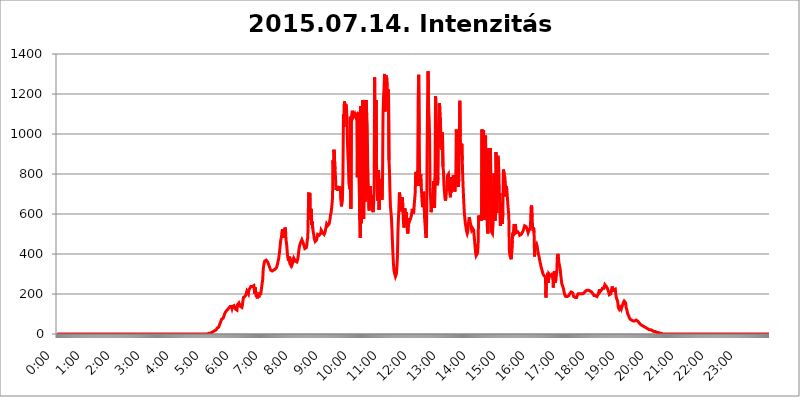
| Category | 2015.07.14. Intenzitás [W/m^2] |
|---|---|
| 0.0 | 0 |
| 0.0006944444444444445 | 0 |
| 0.001388888888888889 | 0 |
| 0.0020833333333333333 | 0 |
| 0.002777777777777778 | 0 |
| 0.003472222222222222 | 0 |
| 0.004166666666666667 | 0 |
| 0.004861111111111111 | 0 |
| 0.005555555555555556 | 0 |
| 0.0062499999999999995 | 0 |
| 0.006944444444444444 | 0 |
| 0.007638888888888889 | 0 |
| 0.008333333333333333 | 0 |
| 0.009027777777777779 | 0 |
| 0.009722222222222222 | 0 |
| 0.010416666666666666 | 0 |
| 0.011111111111111112 | 0 |
| 0.011805555555555555 | 0 |
| 0.012499999999999999 | 0 |
| 0.013194444444444444 | 0 |
| 0.013888888888888888 | 0 |
| 0.014583333333333332 | 0 |
| 0.015277777777777777 | 0 |
| 0.015972222222222224 | 0 |
| 0.016666666666666666 | 0 |
| 0.017361111111111112 | 0 |
| 0.018055555555555557 | 0 |
| 0.01875 | 0 |
| 0.019444444444444445 | 0 |
| 0.02013888888888889 | 0 |
| 0.020833333333333332 | 0 |
| 0.02152777777777778 | 0 |
| 0.022222222222222223 | 0 |
| 0.02291666666666667 | 0 |
| 0.02361111111111111 | 0 |
| 0.024305555555555556 | 0 |
| 0.024999999999999998 | 0 |
| 0.025694444444444447 | 0 |
| 0.02638888888888889 | 0 |
| 0.027083333333333334 | 0 |
| 0.027777777777777776 | 0 |
| 0.02847222222222222 | 0 |
| 0.029166666666666664 | 0 |
| 0.029861111111111113 | 0 |
| 0.030555555555555555 | 0 |
| 0.03125 | 0 |
| 0.03194444444444445 | 0 |
| 0.03263888888888889 | 0 |
| 0.03333333333333333 | 0 |
| 0.034027777777777775 | 0 |
| 0.034722222222222224 | 0 |
| 0.035416666666666666 | 0 |
| 0.036111111111111115 | 0 |
| 0.03680555555555556 | 0 |
| 0.0375 | 0 |
| 0.03819444444444444 | 0 |
| 0.03888888888888889 | 0 |
| 0.03958333333333333 | 0 |
| 0.04027777777777778 | 0 |
| 0.04097222222222222 | 0 |
| 0.041666666666666664 | 0 |
| 0.042361111111111106 | 0 |
| 0.04305555555555556 | 0 |
| 0.043750000000000004 | 0 |
| 0.044444444444444446 | 0 |
| 0.04513888888888889 | 0 |
| 0.04583333333333334 | 0 |
| 0.04652777777777778 | 0 |
| 0.04722222222222222 | 0 |
| 0.04791666666666666 | 0 |
| 0.04861111111111111 | 0 |
| 0.049305555555555554 | 0 |
| 0.049999999999999996 | 0 |
| 0.05069444444444445 | 0 |
| 0.051388888888888894 | 0 |
| 0.052083333333333336 | 0 |
| 0.05277777777777778 | 0 |
| 0.05347222222222222 | 0 |
| 0.05416666666666667 | 0 |
| 0.05486111111111111 | 0 |
| 0.05555555555555555 | 0 |
| 0.05625 | 0 |
| 0.05694444444444444 | 0 |
| 0.057638888888888885 | 0 |
| 0.05833333333333333 | 0 |
| 0.05902777777777778 | 0 |
| 0.059722222222222225 | 0 |
| 0.06041666666666667 | 0 |
| 0.061111111111111116 | 0 |
| 0.06180555555555556 | 0 |
| 0.0625 | 0 |
| 0.06319444444444444 | 0 |
| 0.06388888888888888 | 0 |
| 0.06458333333333334 | 0 |
| 0.06527777777777778 | 0 |
| 0.06597222222222222 | 0 |
| 0.06666666666666667 | 0 |
| 0.06736111111111111 | 0 |
| 0.06805555555555555 | 0 |
| 0.06874999999999999 | 0 |
| 0.06944444444444443 | 0 |
| 0.07013888888888889 | 0 |
| 0.07083333333333333 | 0 |
| 0.07152777777777779 | 0 |
| 0.07222222222222223 | 0 |
| 0.07291666666666667 | 0 |
| 0.07361111111111111 | 0 |
| 0.07430555555555556 | 0 |
| 0.075 | 0 |
| 0.07569444444444444 | 0 |
| 0.0763888888888889 | 0 |
| 0.07708333333333334 | 0 |
| 0.07777777777777778 | 0 |
| 0.07847222222222222 | 0 |
| 0.07916666666666666 | 0 |
| 0.0798611111111111 | 0 |
| 0.08055555555555556 | 0 |
| 0.08125 | 0 |
| 0.08194444444444444 | 0 |
| 0.08263888888888889 | 0 |
| 0.08333333333333333 | 0 |
| 0.08402777777777777 | 0 |
| 0.08472222222222221 | 0 |
| 0.08541666666666665 | 0 |
| 0.08611111111111112 | 0 |
| 0.08680555555555557 | 0 |
| 0.08750000000000001 | 0 |
| 0.08819444444444445 | 0 |
| 0.08888888888888889 | 0 |
| 0.08958333333333333 | 0 |
| 0.09027777777777778 | 0 |
| 0.09097222222222222 | 0 |
| 0.09166666666666667 | 0 |
| 0.09236111111111112 | 0 |
| 0.09305555555555556 | 0 |
| 0.09375 | 0 |
| 0.09444444444444444 | 0 |
| 0.09513888888888888 | 0 |
| 0.09583333333333333 | 0 |
| 0.09652777777777777 | 0 |
| 0.09722222222222222 | 0 |
| 0.09791666666666667 | 0 |
| 0.09861111111111111 | 0 |
| 0.09930555555555555 | 0 |
| 0.09999999999999999 | 0 |
| 0.10069444444444443 | 0 |
| 0.1013888888888889 | 0 |
| 0.10208333333333335 | 0 |
| 0.10277777777777779 | 0 |
| 0.10347222222222223 | 0 |
| 0.10416666666666667 | 0 |
| 0.10486111111111111 | 0 |
| 0.10555555555555556 | 0 |
| 0.10625 | 0 |
| 0.10694444444444444 | 0 |
| 0.1076388888888889 | 0 |
| 0.10833333333333334 | 0 |
| 0.10902777777777778 | 0 |
| 0.10972222222222222 | 0 |
| 0.1111111111111111 | 0 |
| 0.11180555555555556 | 0 |
| 0.11180555555555556 | 0 |
| 0.1125 | 0 |
| 0.11319444444444444 | 0 |
| 0.11388888888888889 | 0 |
| 0.11458333333333333 | 0 |
| 0.11527777777777777 | 0 |
| 0.11597222222222221 | 0 |
| 0.11666666666666665 | 0 |
| 0.1173611111111111 | 0 |
| 0.11805555555555557 | 0 |
| 0.11944444444444445 | 0 |
| 0.12013888888888889 | 0 |
| 0.12083333333333333 | 0 |
| 0.12152777777777778 | 0 |
| 0.12222222222222223 | 0 |
| 0.12291666666666667 | 0 |
| 0.12291666666666667 | 0 |
| 0.12361111111111112 | 0 |
| 0.12430555555555556 | 0 |
| 0.125 | 0 |
| 0.12569444444444444 | 0 |
| 0.12638888888888888 | 0 |
| 0.12708333333333333 | 0 |
| 0.16875 | 0 |
| 0.12847222222222224 | 0 |
| 0.12916666666666668 | 0 |
| 0.12986111111111112 | 0 |
| 0.13055555555555556 | 0 |
| 0.13125 | 0 |
| 0.13194444444444445 | 0 |
| 0.1326388888888889 | 0 |
| 0.13333333333333333 | 0 |
| 0.13402777777777777 | 0 |
| 0.13402777777777777 | 0 |
| 0.13472222222222222 | 0 |
| 0.13541666666666666 | 0 |
| 0.1361111111111111 | 0 |
| 0.13749999999999998 | 0 |
| 0.13819444444444443 | 0 |
| 0.1388888888888889 | 0 |
| 0.13958333333333334 | 0 |
| 0.14027777777777778 | 0 |
| 0.14097222222222222 | 0 |
| 0.14166666666666666 | 0 |
| 0.1423611111111111 | 0 |
| 0.14305555555555557 | 0 |
| 0.14375000000000002 | 0 |
| 0.14444444444444446 | 0 |
| 0.1451388888888889 | 0 |
| 0.1451388888888889 | 0 |
| 0.14652777777777778 | 0 |
| 0.14722222222222223 | 0 |
| 0.14791666666666667 | 0 |
| 0.1486111111111111 | 0 |
| 0.14930555555555555 | 0 |
| 0.15 | 0 |
| 0.15069444444444444 | 0 |
| 0.15138888888888888 | 0 |
| 0.15208333333333332 | 0 |
| 0.15277777777777776 | 0 |
| 0.15347222222222223 | 0 |
| 0.15416666666666667 | 0 |
| 0.15486111111111112 | 0 |
| 0.15555555555555556 | 0 |
| 0.15625 | 0 |
| 0.15694444444444444 | 0 |
| 0.15763888888888888 | 0 |
| 0.15833333333333333 | 0 |
| 0.15902777777777777 | 0 |
| 0.15972222222222224 | 0 |
| 0.16041666666666668 | 0 |
| 0.16111111111111112 | 0 |
| 0.16180555555555556 | 0 |
| 0.1625 | 0 |
| 0.16319444444444445 | 0 |
| 0.1638888888888889 | 0 |
| 0.16458333333333333 | 0 |
| 0.16527777777777777 | 0 |
| 0.16597222222222222 | 0 |
| 0.16666666666666666 | 0 |
| 0.1673611111111111 | 0 |
| 0.16805555555555554 | 0 |
| 0.16874999999999998 | 0 |
| 0.16944444444444443 | 0 |
| 0.17013888888888887 | 0 |
| 0.1708333333333333 | 0 |
| 0.17152777777777775 | 0 |
| 0.17222222222222225 | 0 |
| 0.1729166666666667 | 0 |
| 0.17361111111111113 | 0 |
| 0.17430555555555557 | 0 |
| 0.17500000000000002 | 0 |
| 0.17569444444444446 | 0 |
| 0.1763888888888889 | 0 |
| 0.17708333333333334 | 0 |
| 0.17777777777777778 | 0 |
| 0.17847222222222223 | 0 |
| 0.17916666666666667 | 0 |
| 0.1798611111111111 | 0 |
| 0.18055555555555555 | 0 |
| 0.18125 | 0 |
| 0.18194444444444444 | 0 |
| 0.1826388888888889 | 0 |
| 0.18333333333333335 | 0 |
| 0.1840277777777778 | 0 |
| 0.18472222222222223 | 0 |
| 0.18541666666666667 | 0 |
| 0.18611111111111112 | 0 |
| 0.18680555555555556 | 0 |
| 0.1875 | 0 |
| 0.18819444444444444 | 0 |
| 0.18888888888888888 | 0 |
| 0.18958333333333333 | 0 |
| 0.19027777777777777 | 0 |
| 0.1909722222222222 | 0 |
| 0.19166666666666665 | 0 |
| 0.19236111111111112 | 0 |
| 0.19305555555555554 | 0 |
| 0.19375 | 0 |
| 0.19444444444444445 | 0 |
| 0.1951388888888889 | 0 |
| 0.19583333333333333 | 0 |
| 0.19652777777777777 | 0 |
| 0.19722222222222222 | 0 |
| 0.19791666666666666 | 0 |
| 0.1986111111111111 | 0 |
| 0.19930555555555554 | 0 |
| 0.19999999999999998 | 0 |
| 0.20069444444444443 | 0 |
| 0.20138888888888887 | 0 |
| 0.2020833333333333 | 0 |
| 0.2027777777777778 | 0 |
| 0.2034722222222222 | 0 |
| 0.2041666666666667 | 0 |
| 0.20486111111111113 | 0 |
| 0.20555555555555557 | 0 |
| 0.20625000000000002 | 0 |
| 0.20694444444444446 | 0 |
| 0.2076388888888889 | 0 |
| 0.20833333333333334 | 0 |
| 0.20902777777777778 | 0 |
| 0.20972222222222223 | 0 |
| 0.21041666666666667 | 0 |
| 0.2111111111111111 | 0 |
| 0.21180555555555555 | 3.525 |
| 0.2125 | 3.525 |
| 0.21319444444444444 | 3.525 |
| 0.2138888888888889 | 3.525 |
| 0.21458333333333335 | 3.525 |
| 0.2152777777777778 | 7.887 |
| 0.21597222222222223 | 7.887 |
| 0.21666666666666667 | 7.887 |
| 0.21736111111111112 | 12.257 |
| 0.21805555555555556 | 12.257 |
| 0.21875 | 12.257 |
| 0.21944444444444444 | 16.636 |
| 0.22013888888888888 | 16.636 |
| 0.22083333333333333 | 16.636 |
| 0.22152777777777777 | 21.024 |
| 0.2222222222222222 | 21.024 |
| 0.22291666666666665 | 21.024 |
| 0.2236111111111111 | 25.419 |
| 0.22430555555555556 | 29.823 |
| 0.225 | 29.823 |
| 0.22569444444444445 | 34.234 |
| 0.2263888888888889 | 34.234 |
| 0.22708333333333333 | 38.653 |
| 0.22777777777777777 | 47.511 |
| 0.22847222222222222 | 51.951 |
| 0.22916666666666666 | 60.85 |
| 0.2298611111111111 | 65.31 |
| 0.23055555555555554 | 74.246 |
| 0.23124999999999998 | 74.246 |
| 0.23194444444444443 | 78.722 |
| 0.23263888888888887 | 78.722 |
| 0.2333333333333333 | 83.205 |
| 0.2340277777777778 | 92.184 |
| 0.2347222222222222 | 101.184 |
| 0.2354166666666667 | 105.69 |
| 0.23611111111111113 | 110.201 |
| 0.23680555555555557 | 110.201 |
| 0.23750000000000002 | 114.716 |
| 0.23819444444444446 | 119.235 |
| 0.2388888888888889 | 119.235 |
| 0.23958333333333334 | 123.758 |
| 0.24027777777777778 | 128.284 |
| 0.24097222222222223 | 128.284 |
| 0.24166666666666667 | 132.814 |
| 0.2423611111111111 | 137.347 |
| 0.24305555555555555 | 137.347 |
| 0.24375 | 137.347 |
| 0.24444444444444446 | 137.347 |
| 0.24513888888888888 | 128.284 |
| 0.24583333333333335 | 137.347 |
| 0.2465277777777778 | 137.347 |
| 0.24722222222222223 | 141.884 |
| 0.24791666666666667 | 141.884 |
| 0.24861111111111112 | 141.884 |
| 0.24930555555555556 | 141.884 |
| 0.25 | 123.758 |
| 0.25069444444444444 | 128.284 |
| 0.2513888888888889 | 128.284 |
| 0.2520833333333333 | 119.235 |
| 0.25277777777777777 | 146.423 |
| 0.2534722222222222 | 150.964 |
| 0.25416666666666665 | 150.964 |
| 0.2548611111111111 | 155.509 |
| 0.2555555555555556 | 155.509 |
| 0.25625000000000003 | 160.056 |
| 0.2569444444444445 | 137.347 |
| 0.2576388888888889 | 137.347 |
| 0.25833333333333336 | 137.347 |
| 0.2590277777777778 | 132.814 |
| 0.25972222222222224 | 146.423 |
| 0.2604166666666667 | 146.423 |
| 0.2611111111111111 | 182.82 |
| 0.26180555555555557 | 182.82 |
| 0.2625 | 182.82 |
| 0.26319444444444445 | 187.378 |
| 0.2638888888888889 | 191.937 |
| 0.26458333333333334 | 196.497 |
| 0.2652777777777778 | 205.62 |
| 0.2659722222222222 | 214.746 |
| 0.26666666666666666 | 219.309 |
| 0.2673611111111111 | 214.746 |
| 0.26805555555555555 | 201.058 |
| 0.26875 | 219.309 |
| 0.26944444444444443 | 223.873 |
| 0.2701388888888889 | 228.436 |
| 0.2708333333333333 | 233 |
| 0.27152777777777776 | 237.564 |
| 0.2722222222222222 | 233 |
| 0.27291666666666664 | 242.127 |
| 0.2736111111111111 | 237.564 |
| 0.2743055555555555 | 233 |
| 0.27499999999999997 | 237.564 |
| 0.27569444444444446 | 242.127 |
| 0.27638888888888885 | 237.564 |
| 0.27708333333333335 | 201.058 |
| 0.2777777777777778 | 233 |
| 0.27847222222222223 | 201.058 |
| 0.2791666666666667 | 187.378 |
| 0.2798611111111111 | 205.62 |
| 0.28055555555555556 | 178.264 |
| 0.28125 | 182.82 |
| 0.28194444444444444 | 205.62 |
| 0.2826388888888889 | 182.82 |
| 0.2833333333333333 | 201.058 |
| 0.28402777777777777 | 201.058 |
| 0.2847222222222222 | 196.497 |
| 0.28541666666666665 | 201.058 |
| 0.28611111111111115 | 205.62 |
| 0.28680555555555554 | 237.564 |
| 0.28750000000000003 | 233 |
| 0.2881944444444445 | 274.047 |
| 0.2888888888888889 | 324.052 |
| 0.28958333333333336 | 342.162 |
| 0.2902777777777778 | 355.712 |
| 0.29097222222222224 | 364.728 |
| 0.2916666666666667 | 369.23 |
| 0.2923611111111111 | 369.23 |
| 0.29305555555555557 | 369.23 |
| 0.29375 | 369.23 |
| 0.29444444444444445 | 369.23 |
| 0.2951388888888889 | 360.221 |
| 0.29583333333333334 | 355.712 |
| 0.2965277777777778 | 346.682 |
| 0.2972222222222222 | 342.162 |
| 0.29791666666666666 | 333.113 |
| 0.2986111111111111 | 328.584 |
| 0.29930555555555555 | 319.517 |
| 0.3 | 314.98 |
| 0.30069444444444443 | 314.98 |
| 0.3013888888888889 | 314.98 |
| 0.3020833333333333 | 314.98 |
| 0.30277777777777776 | 314.98 |
| 0.3034722222222222 | 319.517 |
| 0.30416666666666664 | 319.517 |
| 0.3048611111111111 | 319.517 |
| 0.3055555555555555 | 324.052 |
| 0.30624999999999997 | 324.052 |
| 0.3069444444444444 | 328.584 |
| 0.3076388888888889 | 333.113 |
| 0.30833333333333335 | 342.162 |
| 0.3090277777777778 | 351.198 |
| 0.30972222222222223 | 364.728 |
| 0.3104166666666667 | 373.729 |
| 0.3111111111111111 | 391.685 |
| 0.31180555555555556 | 409.574 |
| 0.3125 | 436.27 |
| 0.31319444444444444 | 462.786 |
| 0.3138888888888889 | 475.972 |
| 0.3145833333333333 | 489.108 |
| 0.31527777777777777 | 515.223 |
| 0.3159722222222222 | 523.88 |
| 0.31666666666666665 | 480.356 |
| 0.31736111111111115 | 523.88 |
| 0.31805555555555554 | 480.356 |
| 0.31875000000000003 | 519.555 |
| 0.3194444444444445 | 532.513 |
| 0.3201388888888889 | 523.88 |
| 0.32083333333333336 | 471.582 |
| 0.3215277777777778 | 453.968 |
| 0.32222222222222224 | 427.39 |
| 0.3229166666666667 | 396.164 |
| 0.3236111111111111 | 378.224 |
| 0.32430555555555557 | 364.728 |
| 0.325 | 364.728 |
| 0.32569444444444445 | 387.202 |
| 0.3263888888888889 | 351.198 |
| 0.32708333333333334 | 351.198 |
| 0.3277777777777778 | 342.162 |
| 0.3284722222222222 | 342.162 |
| 0.32916666666666666 | 360.221 |
| 0.3298611111111111 | 351.198 |
| 0.33055555555555555 | 355.712 |
| 0.33125 | 364.728 |
| 0.33194444444444443 | 378.224 |
| 0.3326388888888889 | 382.715 |
| 0.3333333333333333 | 373.729 |
| 0.3340277777777778 | 364.728 |
| 0.3347222222222222 | 360.221 |
| 0.3354166666666667 | 360.221 |
| 0.3361111111111111 | 360.221 |
| 0.3368055555555556 | 364.728 |
| 0.33749999999999997 | 378.224 |
| 0.33819444444444446 | 396.164 |
| 0.33888888888888885 | 418.492 |
| 0.33958333333333335 | 436.27 |
| 0.34027777777777773 | 445.129 |
| 0.34097222222222223 | 453.968 |
| 0.3416666666666666 | 458.38 |
| 0.3423611111111111 | 458.38 |
| 0.3430555555555555 | 471.582 |
| 0.34375 | 471.582 |
| 0.3444444444444445 | 467.187 |
| 0.3451388888888889 | 453.968 |
| 0.3458333333333334 | 449.551 |
| 0.34652777777777777 | 436.27 |
| 0.34722222222222227 | 427.39 |
| 0.34791666666666665 | 422.943 |
| 0.34861111111111115 | 427.39 |
| 0.34930555555555554 | 431.833 |
| 0.35000000000000003 | 440.702 |
| 0.3506944444444444 | 471.582 |
| 0.3513888888888889 | 480.356 |
| 0.3520833333333333 | 609.062 |
| 0.3527777777777778 | 707.8 |
| 0.3534722222222222 | 625.784 |
| 0.3541666666666667 | 703.762 |
| 0.3548611111111111 | 600.661 |
| 0.35555555555555557 | 571.049 |
| 0.35625 | 625.784 |
| 0.35694444444444445 | 545.416 |
| 0.3576388888888889 | 562.53 |
| 0.35833333333333334 | 528.2 |
| 0.3590277777777778 | 510.885 |
| 0.3597222222222222 | 497.836 |
| 0.36041666666666666 | 475.972 |
| 0.3611111111111111 | 480.356 |
| 0.36180555555555555 | 462.786 |
| 0.3625 | 467.187 |
| 0.36319444444444443 | 462.786 |
| 0.3638888888888889 | 471.582 |
| 0.3645833333333333 | 484.735 |
| 0.3652777777777778 | 497.836 |
| 0.3659722222222222 | 497.836 |
| 0.3666666666666667 | 497.836 |
| 0.3673611111111111 | 493.475 |
| 0.3680555555555556 | 489.108 |
| 0.36874999999999997 | 489.108 |
| 0.36944444444444446 | 502.192 |
| 0.37013888888888885 | 519.555 |
| 0.37083333333333335 | 523.88 |
| 0.37152777777777773 | 515.223 |
| 0.37222222222222223 | 506.542 |
| 0.3729166666666666 | 502.192 |
| 0.3736111111111111 | 506.542 |
| 0.3743055555555555 | 497.836 |
| 0.375 | 502.192 |
| 0.3756944444444445 | 510.885 |
| 0.3763888888888889 | 523.88 |
| 0.3770833333333334 | 536.82 |
| 0.37777777777777777 | 549.704 |
| 0.37847222222222227 | 549.704 |
| 0.37916666666666665 | 541.121 |
| 0.37986111111111115 | 536.82 |
| 0.38055555555555554 | 541.121 |
| 0.38125000000000003 | 549.704 |
| 0.3819444444444444 | 562.53 |
| 0.3826388888888889 | 575.299 |
| 0.3833333333333333 | 596.45 |
| 0.3840277777777778 | 604.864 |
| 0.3847222222222222 | 625.784 |
| 0.3854166666666667 | 650.667 |
| 0.3861111111111111 | 683.473 |
| 0.38680555555555557 | 868.305 |
| 0.3875 | 783.342 |
| 0.38819444444444445 | 921.298 |
| 0.3888888888888889 | 925.06 |
| 0.38958333333333334 | 822.26 |
| 0.3902777777777778 | 783.342 |
| 0.3909722222222222 | 719.877 |
| 0.39166666666666666 | 719.877 |
| 0.3923611111111111 | 739.877 |
| 0.39305555555555555 | 735.89 |
| 0.39375 | 715.858 |
| 0.39444444444444443 | 719.877 |
| 0.3951388888888889 | 739.877 |
| 0.3958333333333333 | 719.877 |
| 0.3965277777777778 | 727.896 |
| 0.3972222222222222 | 735.89 |
| 0.3979166666666667 | 667.123 |
| 0.3986111111111111 | 638.256 |
| 0.3993055555555556 | 638.256 |
| 0.39999999999999997 | 683.473 |
| 0.40069444444444446 | 783.342 |
| 0.40138888888888885 | 1097.437 |
| 0.40208333333333335 | 1037.277 |
| 0.40277777777777773 | 1162.571 |
| 0.40347222222222223 | 1147.086 |
| 0.4041666666666666 | 1150.946 |
| 0.4048611111111111 | 1150.946 |
| 0.4055555555555555 | 1143.232 |
| 0.40625 | 1078.555 |
| 0.4069444444444445 | 966.295 |
| 0.4076388888888889 | 894.885 |
| 0.4083333333333334 | 853.029 |
| 0.40902777777777777 | 755.766 |
| 0.40972222222222227 | 751.803 |
| 0.41041666666666665 | 723.889 |
| 0.41111111111111115 | 1086.097 |
| 0.41180555555555554 | 625.784 |
| 0.41250000000000003 | 1078.555 |
| 0.4131944444444444 | 1097.437 |
| 0.4138888888888889 | 1116.426 |
| 0.4145833333333333 | 1112.618 |
| 0.4152777777777778 | 1086.097 |
| 0.4159722222222222 | 1082.324 |
| 0.4166666666666667 | 1089.873 |
| 0.4173611111111111 | 1101.226 |
| 0.41805555555555557 | 1097.437 |
| 0.41875 | 1086.097 |
| 0.41944444444444445 | 1086.097 |
| 0.4201388888888889 | 1093.653 |
| 0.42083333333333334 | 783.342 |
| 0.4215277777777778 | 1078.555 |
| 0.4222222222222222 | 1108.816 |
| 0.42291666666666666 | 1108.816 |
| 0.4236111111111111 | 1108.816 |
| 0.42430555555555555 | 571.049 |
| 0.425 | 480.356 |
| 0.42569444444444443 | 1139.384 |
| 0.4263888888888889 | 553.986 |
| 0.4270833333333333 | 609.062 |
| 0.4277777777777778 | 579.542 |
| 0.4284722222222222 | 1170.358 |
| 0.4291666666666667 | 583.779 |
| 0.4298611111111111 | 575.299 |
| 0.4305555555555556 | 1162.571 |
| 0.43124999999999997 | 1170.358 |
| 0.43194444444444446 | 663.019 |
| 0.43263888888888885 | 872.114 |
| 0.43333333333333335 | 1170.358 |
| 0.43402777777777773 | 1093.653 |
| 0.43472222222222223 | 1044.762 |
| 0.4354166666666666 | 853.029 |
| 0.4361111111111111 | 751.803 |
| 0.4368055555555555 | 638.256 |
| 0.4375 | 617.436 |
| 0.4381944444444445 | 675.311 |
| 0.4388888888888889 | 739.877 |
| 0.4395833333333334 | 683.473 |
| 0.44027777777777777 | 695.666 |
| 0.44097222222222227 | 695.666 |
| 0.44166666666666665 | 663.019 |
| 0.44236111111111115 | 617.436 |
| 0.44305555555555554 | 609.062 |
| 0.44375000000000003 | 650.667 |
| 0.4444444444444444 | 723.889 |
| 0.4451388888888889 | 1283.541 |
| 0.4458333333333333 | 795.074 |
| 0.4465277777777778 | 902.447 |
| 0.4472222222222222 | 1170.358 |
| 0.4479166666666667 | 787.258 |
| 0.4486111111111111 | 715.858 |
| 0.44930555555555557 | 667.123 |
| 0.45 | 707.8 |
| 0.45069444444444445 | 818.392 |
| 0.4513888888888889 | 621.613 |
| 0.45208333333333334 | 625.784 |
| 0.4527777777777778 | 775.492 |
| 0.4534722222222222 | 735.89 |
| 0.45416666666666666 | 735.89 |
| 0.4548611111111111 | 699.717 |
| 0.45555555555555555 | 671.22 |
| 0.45625 | 783.342 |
| 0.45694444444444443 | 1105.019 |
| 0.4576388888888889 | 1186.03 |
| 0.4583333333333333 | 1225.859 |
| 0.4590277777777778 | 1300.514 |
| 0.4597222222222222 | 1112.618 |
| 0.4604166666666667 | 1275.142 |
| 0.4611111111111111 | 1291.997 |
| 0.4618055555555556 | 1283.541 |
| 0.46249999999999997 | 1275.142 |
| 0.46319444444444446 | 1205.82 |
| 0.46388888888888885 | 1186.03 |
| 0.46458333333333335 | 1221.83 |
| 0.46527777777777773 | 868.305 |
| 0.46597222222222223 | 814.519 |
| 0.4666666666666666 | 703.762 |
| 0.4673611111111111 | 634.105 |
| 0.4680555555555555 | 609.062 |
| 0.46875 | 579.542 |
| 0.4694444444444445 | 523.88 |
| 0.4701388888888889 | 458.38 |
| 0.4708333333333334 | 400.638 |
| 0.47152777777777777 | 351.198 |
| 0.47222222222222227 | 319.517 |
| 0.47291666666666665 | 305.898 |
| 0.47361111111111115 | 296.808 |
| 0.47430555555555554 | 287.709 |
| 0.47500000000000003 | 287.709 |
| 0.4756944444444444 | 301.354 |
| 0.4763888888888889 | 333.113 |
| 0.4770833333333333 | 382.715 |
| 0.4777777777777778 | 506.542 |
| 0.4784722222222222 | 571.049 |
| 0.4791666666666667 | 625.784 |
| 0.4798611111111111 | 707.8 |
| 0.48055555555555557 | 695.666 |
| 0.48125 | 634.105 |
| 0.48194444444444445 | 613.252 |
| 0.4826388888888889 | 621.613 |
| 0.48333333333333334 | 654.791 |
| 0.4840277777777778 | 683.473 |
| 0.4847222222222222 | 634.105 |
| 0.48541666666666666 | 571.049 |
| 0.4861111111111111 | 532.513 |
| 0.48680555555555555 | 541.121 |
| 0.4875 | 629.948 |
| 0.48819444444444443 | 588.009 |
| 0.4888888888888889 | 583.779 |
| 0.4895833333333333 | 609.062 |
| 0.4902777777777778 | 549.704 |
| 0.4909722222222222 | 519.555 |
| 0.4916666666666667 | 502.192 |
| 0.4923611111111111 | 528.2 |
| 0.4930555555555556 | 579.542 |
| 0.49374999999999997 | 575.299 |
| 0.49444444444444446 | 566.793 |
| 0.49513888888888885 | 566.793 |
| 0.49583333333333335 | 571.049 |
| 0.49652777777777773 | 588.009 |
| 0.49722222222222223 | 604.864 |
| 0.4979166666666666 | 625.784 |
| 0.4986111111111111 | 613.252 |
| 0.4993055555555555 | 600.661 |
| 0.5 | 609.062 |
| 0.5006944444444444 | 646.537 |
| 0.5013888888888889 | 646.537 |
| 0.5020833333333333 | 707.8 |
| 0.5027777777777778 | 810.641 |
| 0.5034722222222222 | 775.492 |
| 0.5041666666666667 | 806.757 |
| 0.5048611111111111 | 739.877 |
| 0.5055555555555555 | 818.392 |
| 0.50625 | 1178.177 |
| 0.5069444444444444 | 1296.248 |
| 0.5076388888888889 | 999.916 |
| 0.5083333333333333 | 767.62 |
| 0.5090277777777777 | 739.877 |
| 0.5097222222222222 | 798.974 |
| 0.5104166666666666 | 743.859 |
| 0.5111111111111112 | 699.717 |
| 0.5118055555555555 | 658.909 |
| 0.5125000000000001 | 634.105 |
| 0.5131944444444444 | 650.667 |
| 0.513888888888889 | 711.832 |
| 0.5145833333333333 | 650.667 |
| 0.5152777777777778 | 575.299 |
| 0.5159722222222222 | 541.121 |
| 0.5166666666666667 | 502.192 |
| 0.517361111111111 | 480.356 |
| 0.5180555555555556 | 549.704 |
| 0.5187499999999999 | 909.996 |
| 0.5194444444444445 | 1174.263 |
| 0.5201388888888888 | 1313.406 |
| 0.5208333333333334 | 1131.708 |
| 0.5215277777777778 | 1082.324 |
| 0.5222222222222223 | 984.98 |
| 0.5229166666666667 | 719.877 |
| 0.5236111111111111 | 683.473 |
| 0.5243055555555556 | 609.062 |
| 0.525 | 625.784 |
| 0.5256944444444445 | 687.544 |
| 0.5263888888888889 | 695.666 |
| 0.5270833333333333 | 667.123 |
| 0.5277777777777778 | 763.674 |
| 0.5284722222222222 | 707.8 |
| 0.5291666666666667 | 629.948 |
| 0.5298611111111111 | 783.342 |
| 0.5305555555555556 | 1189.969 |
| 0.53125 | 1135.543 |
| 0.5319444444444444 | 747.834 |
| 0.5326388888888889 | 767.62 |
| 0.5333333333333333 | 743.859 |
| 0.5340277777777778 | 783.342 |
| 0.5347222222222222 | 1026.06 |
| 0.5354166666666667 | 1105.019 |
| 0.5361111111111111 | 1154.814 |
| 0.5368055555555555 | 1093.653 |
| 0.5375 | 1074.789 |
| 0.5381944444444444 | 932.576 |
| 0.5388888888888889 | 962.555 |
| 0.5395833333333333 | 921.298 |
| 0.5402777777777777 | 1007.383 |
| 0.5409722222222222 | 837.682 |
| 0.5416666666666666 | 814.519 |
| 0.5423611111111112 | 739.877 |
| 0.5430555555555555 | 711.832 |
| 0.5437500000000001 | 679.395 |
| 0.5444444444444444 | 667.123 |
| 0.545138888888889 | 683.473 |
| 0.5458333333333333 | 683.473 |
| 0.5465277777777778 | 747.834 |
| 0.5472222222222222 | 791.169 |
| 0.5479166666666667 | 791.169 |
| 0.548611111111111 | 798.974 |
| 0.5493055555555556 | 747.834 |
| 0.5499999999999999 | 723.889 |
| 0.5506944444444445 | 703.762 |
| 0.5513888888888888 | 683.473 |
| 0.5520833333333334 | 783.342 |
| 0.5527777777777778 | 707.8 |
| 0.5534722222222223 | 731.896 |
| 0.5541666666666667 | 743.859 |
| 0.5548611111111111 | 775.492 |
| 0.5555555555555556 | 795.074 |
| 0.55625 | 763.674 |
| 0.5569444444444445 | 731.896 |
| 0.5576388888888889 | 711.832 |
| 0.5583333333333333 | 711.832 |
| 0.5590277777777778 | 787.258 |
| 0.5597222222222222 | 1022.323 |
| 0.5604166666666667 | 940.082 |
| 0.5611111111111111 | 802.868 |
| 0.5618055555555556 | 743.859 |
| 0.5625 | 735.89 |
| 0.5631944444444444 | 775.492 |
| 0.5638888888888889 | 951.327 |
| 0.5645833333333333 | 1166.46 |
| 0.5652777777777778 | 988.714 |
| 0.5659722222222222 | 909.996 |
| 0.5666666666666667 | 898.668 |
| 0.5673611111111111 | 951.327 |
| 0.5680555555555555 | 868.305 |
| 0.56875 | 779.42 |
| 0.5694444444444444 | 715.858 |
| 0.5701388888888889 | 663.019 |
| 0.5708333333333333 | 613.252 |
| 0.5715277777777777 | 583.779 |
| 0.5722222222222222 | 558.261 |
| 0.5729166666666666 | 541.121 |
| 0.5736111111111112 | 523.88 |
| 0.5743055555555555 | 510.885 |
| 0.5750000000000001 | 502.192 |
| 0.5756944444444444 | 510.885 |
| 0.576388888888889 | 536.82 |
| 0.5770833333333333 | 562.53 |
| 0.5777777777777778 | 583.779 |
| 0.5784722222222222 | 575.299 |
| 0.5791666666666667 | 558.261 |
| 0.579861111111111 | 549.704 |
| 0.5805555555555556 | 532.513 |
| 0.5812499999999999 | 519.555 |
| 0.5819444444444445 | 515.223 |
| 0.5826388888888888 | 528.2 |
| 0.5833333333333334 | 532.513 |
| 0.5840277777777778 | 519.555 |
| 0.5847222222222223 | 489.108 |
| 0.5854166666666667 | 462.786 |
| 0.5861111111111111 | 431.833 |
| 0.5868055555555556 | 405.108 |
| 0.5875 | 391.685 |
| 0.5881944444444445 | 387.202 |
| 0.5888888888888889 | 387.202 |
| 0.5895833333333333 | 405.108 |
| 0.5902777777777778 | 449.551 |
| 0.5909722222222222 | 592.233 |
| 0.5916666666666667 | 579.542 |
| 0.5923611111111111 | 583.779 |
| 0.5930555555555556 | 566.793 |
| 0.59375 | 592.233 |
| 0.5944444444444444 | 575.299 |
| 0.5951388888888889 | 566.793 |
| 0.5958333333333333 | 1022.323 |
| 0.5965277777777778 | 596.45 |
| 0.5972222222222222 | 928.819 |
| 0.5979166666666667 | 1018.587 |
| 0.5986111111111111 | 571.049 |
| 0.5993055555555555 | 575.299 |
| 0.6 | 634.105 |
| 0.6006944444444444 | 992.448 |
| 0.6013888888888889 | 592.233 |
| 0.6020833333333333 | 625.784 |
| 0.6027777777777777 | 579.542 |
| 0.6034722222222222 | 515.223 |
| 0.6041666666666666 | 502.192 |
| 0.6048611111111112 | 928.819 |
| 0.6055555555555555 | 928.819 |
| 0.6062500000000001 | 743.859 |
| 0.6069444444444444 | 691.608 |
| 0.607638888888889 | 928.819 |
| 0.6083333333333333 | 549.704 |
| 0.6090277777777778 | 510.885 |
| 0.6097222222222222 | 506.542 |
| 0.6104166666666667 | 502.192 |
| 0.611111111111111 | 541.121 |
| 0.6118055555555556 | 625.784 |
| 0.6124999999999999 | 802.868 |
| 0.6131944444444445 | 579.542 |
| 0.6138888888888888 | 566.793 |
| 0.6145833333333334 | 575.299 |
| 0.6152777777777778 | 909.996 |
| 0.6159722222222223 | 818.392 |
| 0.6166666666666667 | 604.864 |
| 0.6173611111111111 | 875.918 |
| 0.6180555555555556 | 891.099 |
| 0.61875 | 868.305 |
| 0.6194444444444445 | 791.169 |
| 0.6201388888888889 | 691.608 |
| 0.6208333333333333 | 703.762 |
| 0.6215277777777778 | 541.121 |
| 0.6222222222222222 | 541.121 |
| 0.6229166666666667 | 634.105 |
| 0.6236111111111111 | 658.909 |
| 0.6243055555555556 | 549.704 |
| 0.625 | 613.252 |
| 0.6256944444444444 | 822.26 |
| 0.6263888888888889 | 818.392 |
| 0.6270833333333333 | 795.074 |
| 0.6277777777777778 | 783.342 |
| 0.6284722222222222 | 751.803 |
| 0.6291666666666667 | 687.544 |
| 0.6298611111111111 | 739.877 |
| 0.6305555555555555 | 719.877 |
| 0.63125 | 687.544 |
| 0.6319444444444444 | 650.667 |
| 0.6326388888888889 | 617.436 |
| 0.6333333333333333 | 592.233 |
| 0.6340277777777777 | 422.943 |
| 0.6347222222222222 | 396.164 |
| 0.6354166666666666 | 387.202 |
| 0.6361111111111112 | 382.715 |
| 0.6368055555555555 | 373.729 |
| 0.6375000000000001 | 369.23 |
| 0.6381944444444444 | 467.187 |
| 0.638888888888889 | 506.542 |
| 0.6395833333333333 | 489.108 |
| 0.6402777777777778 | 484.735 |
| 0.6409722222222222 | 549.704 |
| 0.6416666666666667 | 532.513 |
| 0.642361111111111 | 549.704 |
| 0.6430555555555556 | 532.513 |
| 0.6437499999999999 | 506.542 |
| 0.6444444444444445 | 510.885 |
| 0.6451388888888888 | 510.885 |
| 0.6458333333333334 | 510.885 |
| 0.6465277777777778 | 510.885 |
| 0.6472222222222223 | 506.542 |
| 0.6479166666666667 | 502.192 |
| 0.6486111111111111 | 493.475 |
| 0.6493055555555556 | 489.108 |
| 0.65 | 493.475 |
| 0.6506944444444445 | 497.836 |
| 0.6513888888888889 | 502.192 |
| 0.6520833333333333 | 506.542 |
| 0.6527777777777778 | 510.885 |
| 0.6534722222222222 | 515.223 |
| 0.6541666666666667 | 523.88 |
| 0.6548611111111111 | 532.513 |
| 0.6555555555555556 | 541.121 |
| 0.65625 | 541.121 |
| 0.6569444444444444 | 541.121 |
| 0.6576388888888889 | 536.82 |
| 0.6583333333333333 | 532.513 |
| 0.6590277777777778 | 523.88 |
| 0.6597222222222222 | 515.223 |
| 0.6604166666666667 | 506.542 |
| 0.6611111111111111 | 506.542 |
| 0.6618055555555555 | 519.555 |
| 0.6625 | 515.223 |
| 0.6631944444444444 | 528.2 |
| 0.6638888888888889 | 558.261 |
| 0.6645833333333333 | 634.105 |
| 0.6652777777777777 | 642.4 |
| 0.6659722222222222 | 579.542 |
| 0.6666666666666666 | 536.82 |
| 0.6673611111111111 | 515.223 |
| 0.6680555555555556 | 532.513 |
| 0.6687500000000001 | 506.542 |
| 0.6694444444444444 | 387.202 |
| 0.6701388888888888 | 449.551 |
| 0.6708333333333334 | 440.702 |
| 0.6715277777777778 | 445.129 |
| 0.6722222222222222 | 449.551 |
| 0.6729166666666666 | 440.702 |
| 0.6736111111111112 | 427.39 |
| 0.6743055555555556 | 409.574 |
| 0.6749999999999999 | 396.164 |
| 0.6756944444444444 | 387.202 |
| 0.6763888888888889 | 373.729 |
| 0.6770833333333334 | 360.221 |
| 0.6777777777777777 | 351.198 |
| 0.6784722222222223 | 337.639 |
| 0.6791666666666667 | 328.584 |
| 0.6798611111111111 | 324.052 |
| 0.6805555555555555 | 310.44 |
| 0.68125 | 301.354 |
| 0.6819444444444445 | 296.808 |
| 0.6826388888888889 | 292.259 |
| 0.6833333333333332 | 287.709 |
| 0.6840277777777778 | 287.709 |
| 0.6847222222222222 | 283.156 |
| 0.6854166666666667 | 182.82 |
| 0.686111111111111 | 278.603 |
| 0.6868055555555556 | 283.156 |
| 0.6875 | 296.808 |
| 0.6881944444444444 | 305.898 |
| 0.688888888888889 | 255.813 |
| 0.6895833333333333 | 301.354 |
| 0.6902777777777778 | 301.354 |
| 0.6909722222222222 | 296.808 |
| 0.6916666666666668 | 292.259 |
| 0.6923611111111111 | 287.709 |
| 0.6930555555555555 | 287.709 |
| 0.69375 | 287.709 |
| 0.6944444444444445 | 296.808 |
| 0.6951388888888889 | 305.898 |
| 0.6958333333333333 | 233 |
| 0.6965277777777777 | 292.259 |
| 0.6972222222222223 | 314.98 |
| 0.6979166666666666 | 255.813 |
| 0.6986111111111111 | 260.373 |
| 0.6993055555555556 | 269.49 |
| 0.7000000000000001 | 292.259 |
| 0.7006944444444444 | 314.98 |
| 0.7013888888888888 | 382.715 |
| 0.7020833333333334 | 400.638 |
| 0.7027777777777778 | 387.202 |
| 0.7034722222222222 | 360.221 |
| 0.7041666666666666 | 355.712 |
| 0.7048611111111112 | 333.113 |
| 0.7055555555555556 | 319.517 |
| 0.7062499999999999 | 292.259 |
| 0.7069444444444444 | 296.808 |
| 0.7076388888888889 | 251.251 |
| 0.7083333333333334 | 255.813 |
| 0.7090277777777777 | 237.564 |
| 0.7097222222222223 | 237.564 |
| 0.7104166666666667 | 219.309 |
| 0.7111111111111111 | 205.62 |
| 0.7118055555555555 | 196.497 |
| 0.7125 | 196.497 |
| 0.7131944444444445 | 187.378 |
| 0.7138888888888889 | 182.82 |
| 0.7145833333333332 | 182.82 |
| 0.7152777777777778 | 187.378 |
| 0.7159722222222222 | 187.378 |
| 0.7166666666666667 | 187.378 |
| 0.717361111111111 | 191.937 |
| 0.7180555555555556 | 196.497 |
| 0.71875 | 201.058 |
| 0.7194444444444444 | 201.058 |
| 0.720138888888889 | 201.058 |
| 0.7208333333333333 | 210.182 |
| 0.7215277777777778 | 214.746 |
| 0.7222222222222222 | 210.182 |
| 0.7229166666666668 | 205.62 |
| 0.7236111111111111 | 196.497 |
| 0.7243055555555555 | 187.378 |
| 0.725 | 182.82 |
| 0.7256944444444445 | 182.82 |
| 0.7263888888888889 | 182.82 |
| 0.7270833333333333 | 182.82 |
| 0.7277777777777777 | 182.82 |
| 0.7284722222222223 | 182.82 |
| 0.7291666666666666 | 191.937 |
| 0.7298611111111111 | 196.497 |
| 0.7305555555555556 | 201.058 |
| 0.7312500000000001 | 196.497 |
| 0.7319444444444444 | 196.497 |
| 0.7326388888888888 | 201.058 |
| 0.7333333333333334 | 196.497 |
| 0.7340277777777778 | 201.058 |
| 0.7347222222222222 | 201.058 |
| 0.7354166666666666 | 201.058 |
| 0.7361111111111112 | 201.058 |
| 0.7368055555555556 | 201.058 |
| 0.7374999999999999 | 205.62 |
| 0.7381944444444444 | 205.62 |
| 0.7388888888888889 | 205.62 |
| 0.7395833333333334 | 205.62 |
| 0.7402777777777777 | 210.182 |
| 0.7409722222222223 | 214.746 |
| 0.7416666666666667 | 214.746 |
| 0.7423611111111111 | 214.746 |
| 0.7430555555555555 | 219.309 |
| 0.74375 | 219.309 |
| 0.7444444444444445 | 219.309 |
| 0.7451388888888889 | 219.309 |
| 0.7458333333333332 | 219.309 |
| 0.7465277777777778 | 219.309 |
| 0.7472222222222222 | 214.746 |
| 0.7479166666666667 | 214.746 |
| 0.748611111111111 | 210.182 |
| 0.7493055555555556 | 210.182 |
| 0.75 | 210.182 |
| 0.7506944444444444 | 205.62 |
| 0.751388888888889 | 201.058 |
| 0.7520833333333333 | 196.497 |
| 0.7527777777777778 | 191.937 |
| 0.7534722222222222 | 191.937 |
| 0.7541666666666668 | 191.937 |
| 0.7548611111111111 | 191.937 |
| 0.7555555555555555 | 187.378 |
| 0.75625 | 187.378 |
| 0.7569444444444445 | 187.378 |
| 0.7576388888888889 | 191.937 |
| 0.7583333333333333 | 196.497 |
| 0.7590277777777777 | 201.058 |
| 0.7597222222222223 | 210.182 |
| 0.7604166666666666 | 223.873 |
| 0.7611111111111111 | 210.182 |
| 0.7618055555555556 | 210.182 |
| 0.7625000000000001 | 214.746 |
| 0.7631944444444444 | 219.309 |
| 0.7638888888888888 | 223.873 |
| 0.7645833333333334 | 228.436 |
| 0.7652777777777778 | 228.436 |
| 0.7659722222222222 | 228.436 |
| 0.7666666666666666 | 228.436 |
| 0.7673611111111112 | 233 |
| 0.7680555555555556 | 246.689 |
| 0.7687499999999999 | 251.251 |
| 0.7694444444444444 | 246.689 |
| 0.7701388888888889 | 237.564 |
| 0.7708333333333334 | 233 |
| 0.7715277777777777 | 228.436 |
| 0.7722222222222223 | 223.873 |
| 0.7729166666666667 | 214.746 |
| 0.7736111111111111 | 205.62 |
| 0.7743055555555555 | 196.497 |
| 0.775 | 196.497 |
| 0.7756944444444445 | 196.497 |
| 0.7763888888888889 | 201.058 |
| 0.7770833333333332 | 214.746 |
| 0.7777777777777778 | 228.436 |
| 0.7784722222222222 | 237.564 |
| 0.7791666666666667 | 237.564 |
| 0.779861111111111 | 210.182 |
| 0.7805555555555556 | 219.309 |
| 0.78125 | 223.873 |
| 0.7819444444444444 | 223.873 |
| 0.782638888888889 | 223.873 |
| 0.7833333333333333 | 201.058 |
| 0.7840277777777778 | 182.82 |
| 0.7847222222222222 | 182.82 |
| 0.7854166666666668 | 169.156 |
| 0.7861111111111111 | 160.056 |
| 0.7868055555555555 | 132.814 |
| 0.7875 | 128.284 |
| 0.7881944444444445 | 123.758 |
| 0.7888888888888889 | 128.284 |
| 0.7895833333333333 | 132.814 |
| 0.7902777777777777 | 128.284 |
| 0.7909722222222223 | 123.758 |
| 0.7916666666666666 | 132.814 |
| 0.7923611111111111 | 137.347 |
| 0.7930555555555556 | 146.423 |
| 0.7937500000000001 | 155.509 |
| 0.7944444444444444 | 160.056 |
| 0.7951388888888888 | 164.605 |
| 0.7958333333333334 | 164.605 |
| 0.7965277777777778 | 164.605 |
| 0.7972222222222222 | 155.509 |
| 0.7979166666666666 | 132.814 |
| 0.7986111111111112 | 132.814 |
| 0.7993055555555556 | 114.716 |
| 0.7999999999999999 | 101.184 |
| 0.8006944444444444 | 96.682 |
| 0.8013888888888889 | 92.184 |
| 0.8020833333333334 | 83.205 |
| 0.8027777777777777 | 78.722 |
| 0.8034722222222223 | 74.246 |
| 0.8041666666666667 | 74.246 |
| 0.8048611111111111 | 74.246 |
| 0.8055555555555555 | 69.775 |
| 0.80625 | 65.31 |
| 0.8069444444444445 | 65.31 |
| 0.8076388888888889 | 65.31 |
| 0.8083333333333332 | 65.31 |
| 0.8090277777777778 | 65.31 |
| 0.8097222222222222 | 65.31 |
| 0.8104166666666667 | 69.775 |
| 0.811111111111111 | 69.775 |
| 0.8118055555555556 | 69.775 |
| 0.8125 | 69.775 |
| 0.8131944444444444 | 65.31 |
| 0.813888888888889 | 65.31 |
| 0.8145833333333333 | 65.31 |
| 0.8152777777777778 | 60.85 |
| 0.8159722222222222 | 56.398 |
| 0.8166666666666668 | 56.398 |
| 0.8173611111111111 | 51.951 |
| 0.8180555555555555 | 47.511 |
| 0.81875 | 47.511 |
| 0.8194444444444445 | 43.079 |
| 0.8201388888888889 | 43.079 |
| 0.8208333333333333 | 38.653 |
| 0.8215277777777777 | 38.653 |
| 0.8222222222222223 | 38.653 |
| 0.8229166666666666 | 34.234 |
| 0.8236111111111111 | 34.234 |
| 0.8243055555555556 | 34.234 |
| 0.8250000000000001 | 29.823 |
| 0.8256944444444444 | 29.823 |
| 0.8263888888888888 | 29.823 |
| 0.8270833333333334 | 29.823 |
| 0.8277777777777778 | 25.419 |
| 0.8284722222222222 | 25.419 |
| 0.8291666666666666 | 25.419 |
| 0.8298611111111112 | 21.024 |
| 0.8305555555555556 | 21.024 |
| 0.8312499999999999 | 21.024 |
| 0.8319444444444444 | 21.024 |
| 0.8326388888888889 | 21.024 |
| 0.8333333333333334 | 16.636 |
| 0.8340277777777777 | 16.636 |
| 0.8347222222222223 | 16.636 |
| 0.8354166666666667 | 16.636 |
| 0.8361111111111111 | 16.636 |
| 0.8368055555555555 | 12.257 |
| 0.8375 | 12.257 |
| 0.8381944444444445 | 12.257 |
| 0.8388888888888889 | 12.257 |
| 0.8395833333333332 | 12.257 |
| 0.8402777777777778 | 12.257 |
| 0.8409722222222222 | 7.887 |
| 0.8416666666666667 | 7.887 |
| 0.842361111111111 | 7.887 |
| 0.8430555555555556 | 7.887 |
| 0.84375 | 7.887 |
| 0.8444444444444444 | 7.887 |
| 0.845138888888889 | 3.525 |
| 0.8458333333333333 | 3.525 |
| 0.8465277777777778 | 3.525 |
| 0.8472222222222222 | 3.525 |
| 0.8479166666666668 | 3.525 |
| 0.8486111111111111 | 3.525 |
| 0.8493055555555555 | 0 |
| 0.85 | 0 |
| 0.8506944444444445 | 0 |
| 0.8513888888888889 | 0 |
| 0.8520833333333333 | 0 |
| 0.8527777777777777 | 0 |
| 0.8534722222222223 | 0 |
| 0.8541666666666666 | 0 |
| 0.8548611111111111 | 0 |
| 0.8555555555555556 | 0 |
| 0.8562500000000001 | 0 |
| 0.8569444444444444 | 0 |
| 0.8576388888888888 | 0 |
| 0.8583333333333334 | 0 |
| 0.8590277777777778 | 0 |
| 0.8597222222222222 | 0 |
| 0.8604166666666666 | 0 |
| 0.8611111111111112 | 0 |
| 0.8618055555555556 | 0 |
| 0.8624999999999999 | 0 |
| 0.8631944444444444 | 0 |
| 0.8638888888888889 | 0 |
| 0.8645833333333334 | 0 |
| 0.8652777777777777 | 0 |
| 0.8659722222222223 | 0 |
| 0.8666666666666667 | 0 |
| 0.8673611111111111 | 0 |
| 0.8680555555555555 | 0 |
| 0.86875 | 0 |
| 0.8694444444444445 | 0 |
| 0.8701388888888889 | 0 |
| 0.8708333333333332 | 0 |
| 0.8715277777777778 | 0 |
| 0.8722222222222222 | 0 |
| 0.8729166666666667 | 0 |
| 0.873611111111111 | 0 |
| 0.8743055555555556 | 0 |
| 0.875 | 0 |
| 0.8756944444444444 | 0 |
| 0.876388888888889 | 0 |
| 0.8770833333333333 | 0 |
| 0.8777777777777778 | 0 |
| 0.8784722222222222 | 0 |
| 0.8791666666666668 | 0 |
| 0.8798611111111111 | 0 |
| 0.8805555555555555 | 0 |
| 0.88125 | 0 |
| 0.8819444444444445 | 0 |
| 0.8826388888888889 | 0 |
| 0.8833333333333333 | 0 |
| 0.8840277777777777 | 0 |
| 0.8847222222222223 | 0 |
| 0.8854166666666666 | 0 |
| 0.8861111111111111 | 0 |
| 0.8868055555555556 | 0 |
| 0.8875000000000001 | 0 |
| 0.8881944444444444 | 0 |
| 0.8888888888888888 | 0 |
| 0.8895833333333334 | 0 |
| 0.8902777777777778 | 0 |
| 0.8909722222222222 | 0 |
| 0.8916666666666666 | 0 |
| 0.8923611111111112 | 0 |
| 0.8930555555555556 | 0 |
| 0.8937499999999999 | 0 |
| 0.8944444444444444 | 0 |
| 0.8951388888888889 | 0 |
| 0.8958333333333334 | 0 |
| 0.8965277777777777 | 0 |
| 0.8972222222222223 | 0 |
| 0.8979166666666667 | 0 |
| 0.8986111111111111 | 0 |
| 0.8993055555555555 | 0 |
| 0.9 | 0 |
| 0.9006944444444445 | 0 |
| 0.9013888888888889 | 0 |
| 0.9020833333333332 | 0 |
| 0.9027777777777778 | 0 |
| 0.9034722222222222 | 0 |
| 0.9041666666666667 | 0 |
| 0.904861111111111 | 0 |
| 0.9055555555555556 | 0 |
| 0.90625 | 0 |
| 0.9069444444444444 | 0 |
| 0.907638888888889 | 0 |
| 0.9083333333333333 | 0 |
| 0.9090277777777778 | 0 |
| 0.9097222222222222 | 0 |
| 0.9104166666666668 | 0 |
| 0.9111111111111111 | 0 |
| 0.9118055555555555 | 0 |
| 0.9125 | 0 |
| 0.9131944444444445 | 0 |
| 0.9138888888888889 | 0 |
| 0.9145833333333333 | 0 |
| 0.9152777777777777 | 0 |
| 0.9159722222222223 | 0 |
| 0.9166666666666666 | 0 |
| 0.9173611111111111 | 0 |
| 0.9180555555555556 | 0 |
| 0.9187500000000001 | 0 |
| 0.9194444444444444 | 0 |
| 0.9201388888888888 | 0 |
| 0.9208333333333334 | 0 |
| 0.9215277777777778 | 0 |
| 0.9222222222222222 | 0 |
| 0.9229166666666666 | 0 |
| 0.9236111111111112 | 0 |
| 0.9243055555555556 | 0 |
| 0.9249999999999999 | 0 |
| 0.9256944444444444 | 0 |
| 0.9263888888888889 | 0 |
| 0.9270833333333334 | 0 |
| 0.9277777777777777 | 0 |
| 0.9284722222222223 | 0 |
| 0.9291666666666667 | 0 |
| 0.9298611111111111 | 0 |
| 0.9305555555555555 | 0 |
| 0.93125 | 0 |
| 0.9319444444444445 | 0 |
| 0.9326388888888889 | 0 |
| 0.9333333333333332 | 0 |
| 0.9340277777777778 | 0 |
| 0.9347222222222222 | 0 |
| 0.9354166666666667 | 0 |
| 0.936111111111111 | 0 |
| 0.9368055555555556 | 0 |
| 0.9375 | 0 |
| 0.9381944444444444 | 0 |
| 0.938888888888889 | 0 |
| 0.9395833333333333 | 0 |
| 0.9402777777777778 | 0 |
| 0.9409722222222222 | 0 |
| 0.9416666666666668 | 0 |
| 0.9423611111111111 | 0 |
| 0.9430555555555555 | 0 |
| 0.94375 | 0 |
| 0.9444444444444445 | 0 |
| 0.9451388888888889 | 0 |
| 0.9458333333333333 | 0 |
| 0.9465277777777777 | 0 |
| 0.9472222222222223 | 0 |
| 0.9479166666666666 | 0 |
| 0.9486111111111111 | 0 |
| 0.9493055555555556 | 0 |
| 0.9500000000000001 | 0 |
| 0.9506944444444444 | 0 |
| 0.9513888888888888 | 0 |
| 0.9520833333333334 | 0 |
| 0.9527777777777778 | 0 |
| 0.9534722222222222 | 0 |
| 0.9541666666666666 | 0 |
| 0.9548611111111112 | 0 |
| 0.9555555555555556 | 0 |
| 0.9562499999999999 | 0 |
| 0.9569444444444444 | 0 |
| 0.9576388888888889 | 0 |
| 0.9583333333333334 | 0 |
| 0.9590277777777777 | 0 |
| 0.9597222222222223 | 0 |
| 0.9604166666666667 | 0 |
| 0.9611111111111111 | 0 |
| 0.9618055555555555 | 0 |
| 0.9625 | 0 |
| 0.9631944444444445 | 0 |
| 0.9638888888888889 | 0 |
| 0.9645833333333332 | 0 |
| 0.9652777777777778 | 0 |
| 0.9659722222222222 | 0 |
| 0.9666666666666667 | 0 |
| 0.967361111111111 | 0 |
| 0.9680555555555556 | 0 |
| 0.96875 | 0 |
| 0.9694444444444444 | 0 |
| 0.970138888888889 | 0 |
| 0.9708333333333333 | 0 |
| 0.9715277777777778 | 0 |
| 0.9722222222222222 | 0 |
| 0.9729166666666668 | 0 |
| 0.9736111111111111 | 0 |
| 0.9743055555555555 | 0 |
| 0.975 | 0 |
| 0.9756944444444445 | 0 |
| 0.9763888888888889 | 0 |
| 0.9770833333333333 | 0 |
| 0.9777777777777777 | 0 |
| 0.9784722222222223 | 0 |
| 0.9791666666666666 | 0 |
| 0.9798611111111111 | 0 |
| 0.9805555555555556 | 0 |
| 0.9812500000000001 | 0 |
| 0.9819444444444444 | 0 |
| 0.9826388888888888 | 0 |
| 0.9833333333333334 | 0 |
| 0.9840277777777778 | 0 |
| 0.9847222222222222 | 0 |
| 0.9854166666666666 | 0 |
| 0.9861111111111112 | 0 |
| 0.9868055555555556 | 0 |
| 0.9874999999999999 | 0 |
| 0.9881944444444444 | 0 |
| 0.9888888888888889 | 0 |
| 0.9895833333333334 | 0 |
| 0.9902777777777777 | 0 |
| 0.9909722222222223 | 0 |
| 0.9916666666666667 | 0 |
| 0.9923611111111111 | 0 |
| 0.9930555555555555 | 0 |
| 0.99375 | 0 |
| 0.9944444444444445 | 0 |
| 0.9951388888888889 | 0 |
| 0.9958333333333332 | 0 |
| 0.9965277777777778 | 0 |
| 0.9972222222222222 | 0 |
| 0.9979166666666667 | 0 |
| 0.998611111111111 | 0 |
| 0.9993055555555556 | 0 |